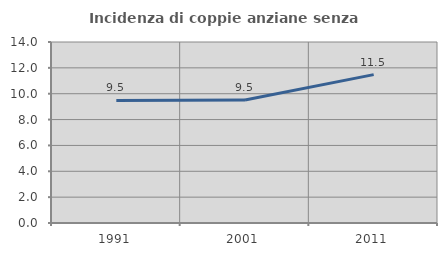
| Category | Incidenza di coppie anziane senza figli  |
|---|---|
| 1991.0 | 9.483 |
| 2001.0 | 9.512 |
| 2011.0 | 11.475 |